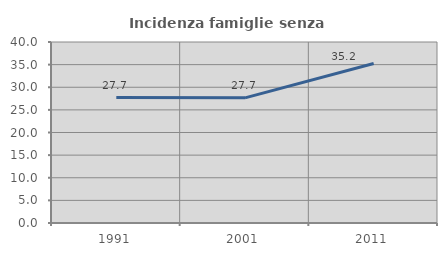
| Category | Incidenza famiglie senza nuclei |
|---|---|
| 1991.0 | 27.719 |
| 2001.0 | 27.652 |
| 2011.0 | 35.243 |